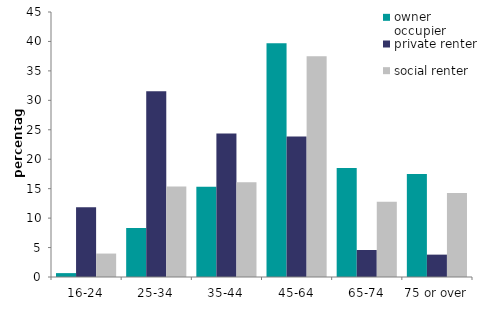
| Category | owner occupier | private renter | social renter |
|---|---|---|---|
| 16-24 | 0.659 | 11.845 | 3.98 |
| 25-34 | 8.319 | 31.538 | 15.372 |
| 35-44 | 15.307 | 24.365 | 16.084 |
| 45-64 | 39.695 | 23.873 | 37.501 |
| 65-74 | 18.514 | 4.581 | 12.786 |
| 75 or over | 17.506 | 3.799 | 14.276 |